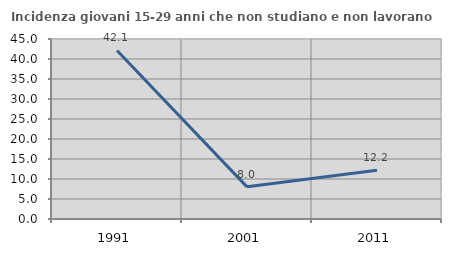
| Category | Incidenza giovani 15-29 anni che non studiano e non lavorano  |
|---|---|
| 1991.0 | 42.13 |
| 2001.0 | 8.039 |
| 2011.0 | 12.203 |